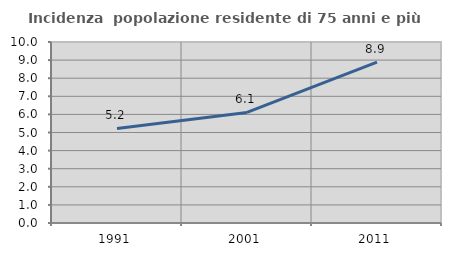
| Category | Incidenza  popolazione residente di 75 anni e più |
|---|---|
| 1991.0 | 5.224 |
| 2001.0 | 6.111 |
| 2011.0 | 8.893 |